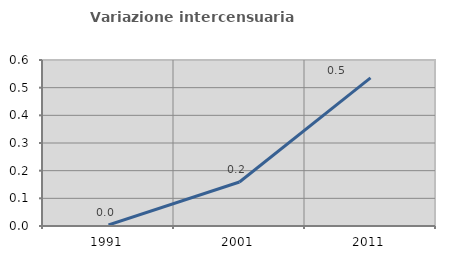
| Category | Variazione intercensuaria annua |
|---|---|
| 1991.0 | 0.004 |
| 2001.0 | 0.159 |
| 2011.0 | 0.535 |